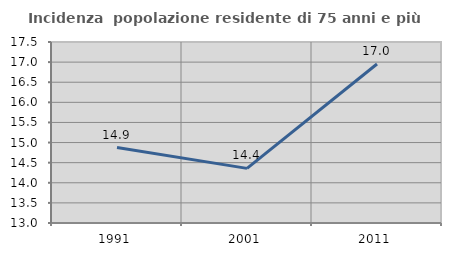
| Category | Incidenza  popolazione residente di 75 anni e più |
|---|---|
| 1991.0 | 14.876 |
| 2001.0 | 14.358 |
| 2011.0 | 16.954 |